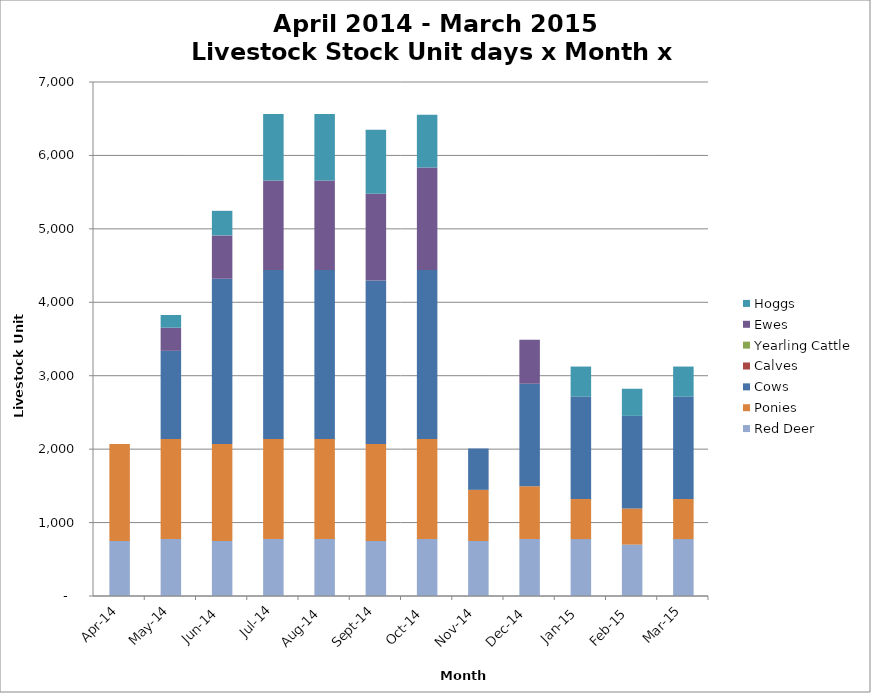
| Category | Red Deer | Ponies | Cows | Calves | Yearling Cattle | Ewes | Hoggs |
|---|---|---|---|---|---|---|---|
| 2014-04-01 | 750 | 1320 | 0 | 0 | 0 | 0 | 0 |
| 2014-05-01 | 775 | 1364 | 1200 | 0 | 0 | 315.2 | 172.8 |
| 2014-06-01 | 750 | 1320 | 2250 | 0 | 0 | 591 | 334.8 |
| 2014-07-01 | 775 | 1364 | 2301.75 | 0 | 0 | 1218.3 | 903.96 |
| 2014-08-01 | 775 | 1364 | 2301.75 | 0 | 0 | 1218.3 | 903.96 |
| 2014-09-01 | 750 | 1320 | 2227.5 | 0 | 0 | 1179 | 874.8 |
| 2014-10-01 | 775 | 1364 | 2301.75 | 0 | 0 | 1395 | 717.96 |
| 2014-11-01 | 750 | 696 | 562.5 | 0 | 0 | 0 | 0 |
| 2014-12-01 | 775 | 719.2 | 1395 | 0 | 0 | 600 | 0 |
| 2015-01-01 | 775 | 545.6 | 1395 | 0 | 0 | 0 | 409.2 |
| 2015-02-01 | 700 | 492.8 | 1260 | 0 | 0 | 0 | 369.6 |
| 2015-03-01 | 775 | 545.6 | 1395 | 0 | 0 | 0 | 409.2 |